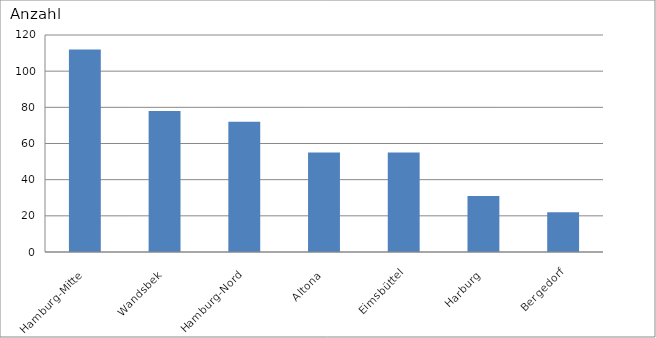
| Category | Hamburg-Mitte |
|---|---|
| Hamburg-Mitte | 112 |
| Wandsbek | 78 |
| Hamburg-Nord | 72 |
| Altona | 55 |
| Eimsbüttel | 55 |
| Harburg | 31 |
| Bergedorf | 22 |